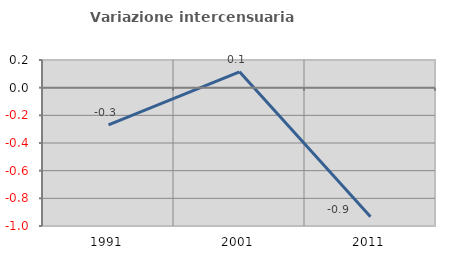
| Category | Variazione intercensuaria annua |
|---|---|
| 1991.0 | -0.269 |
| 2001.0 | 0.114 |
| 2011.0 | -0.933 |